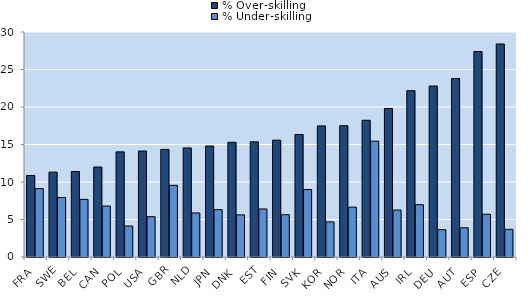
| Category | % Over-skilling | % Under-skilling |
|---|---|---|
| FRA | 10.87 | 9.117 |
| SWE | 11.316 | 7.926 |
| BEL | 11.403 | 7.687 |
| CAN | 11.996 | 6.794 |
| POL | 14.017 | 4.13 |
| USA | 14.129 | 5.371 |
| GBR | 14.342 | 9.559 |
| NLD | 14.544 | 5.877 |
| JPN | 14.791 | 6.312 |
| DNK | 15.289 | 5.616 |
| EST | 15.351 | 6.406 |
| FIN | 15.577 | 5.636 |
| SVK | 16.328 | 8.994 |
| KOR | 17.483 | 4.679 |
| NOR | 17.509 | 6.645 |
| ITA | 18.23 | 15.443 |
| AUS | 19.799 | 6.262 |
| IRL | 22.174 | 6.973 |
| DEU | 22.797 | 3.641 |
| AUT | 23.795 | 3.896 |
| ESP | 27.39 | 5.704 |
| CZE | 28.406 | 3.689 |